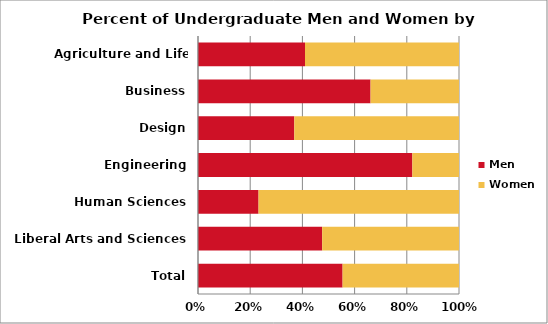
| Category | Men | Women |
|---|---|---|
| Agriculture and Life Sciences | 1521 | 2189 |
| Business | 2896 | 1484 |
| Design | 711 | 1216 |
| Engineering | 5523 | 1202 |
| Human Sciences | 670 | 2218 |
| Liberal Arts and Sciences | 2713 | 2989 |
| Total | 14034 | 11298 |